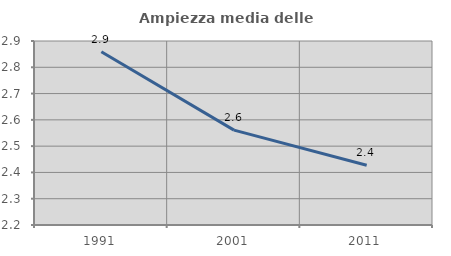
| Category | Ampiezza media delle famiglie |
|---|---|
| 1991.0 | 2.859 |
| 2001.0 | 2.561 |
| 2011.0 | 2.427 |